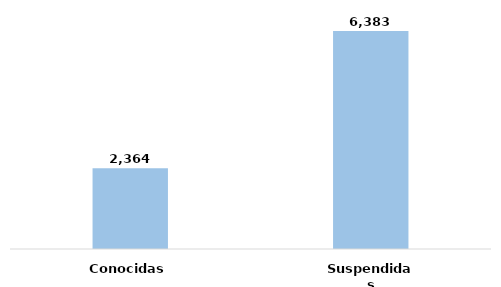
| Category | Series 0 |
|---|---|
| Conocidas | 0.27 |
| Suspendidas | 0.73 |